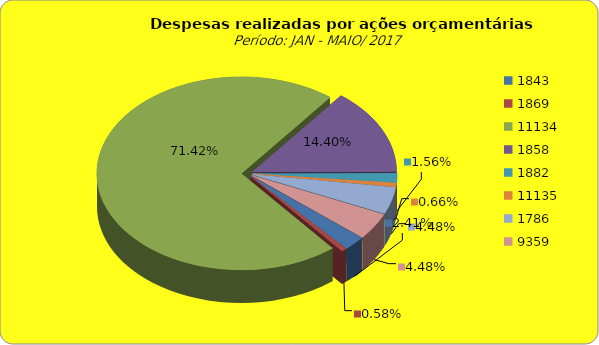
| Category | Series 1 |
|---|---|
| 1843.0 | 2248489.7 |
| 1869.0 | 541951.57 |
| 11134.0 | 66509679.18 |
| 1858.0 | 13405224.22 |
| 1882.0 | 1456237.61 |
| 11135.0 | 612198.5 |
| 1786.0 | 4175124.83 |
| 9359.0 | 4175124.83 |